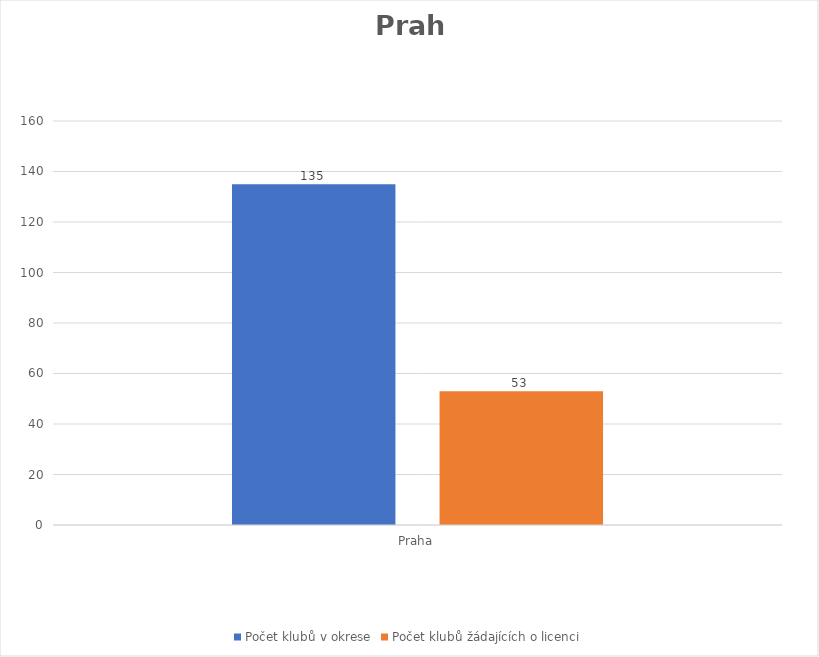
| Category | Počet klubů v okrese | Počet klubů žádajících o licenci |
|---|---|---|
| Praha | 135 | 53 |